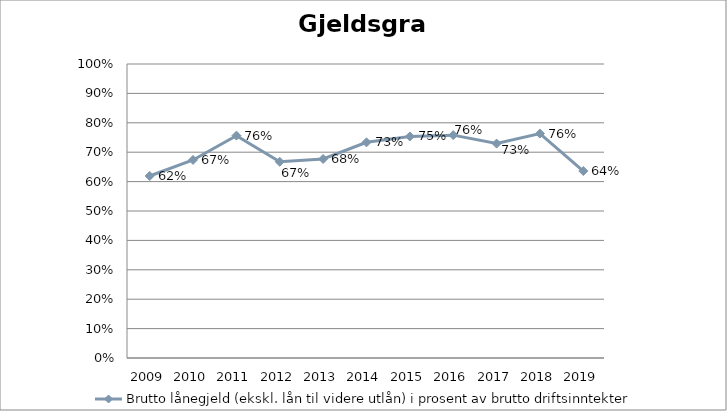
| Category | Brutto lånegjeld (ekskl. lån til videre utlån) i prosent av brutto driftsinntekter |
|---|---|
| 2009.0 | 0.619 |
| 2010.0 | 0.674 |
| 2011.0 | 0.756 |
| 2012.0 | 0.667 |
| 2013.0 | 0.677 |
| 2014.0 | 0.734 |
| 2015.0 | 0.754 |
| 2016.0 | 0.758 |
| 2017.0 | 0.729 |
| 2018.0 | 0.763 |
| 2019.0 | 0.636 |